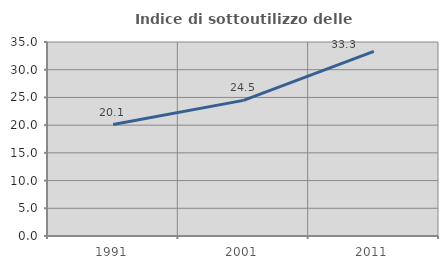
| Category | Indice di sottoutilizzo delle abitazioni  |
|---|---|
| 1991.0 | 20.112 |
| 2001.0 | 24.466 |
| 2011.0 | 33.301 |